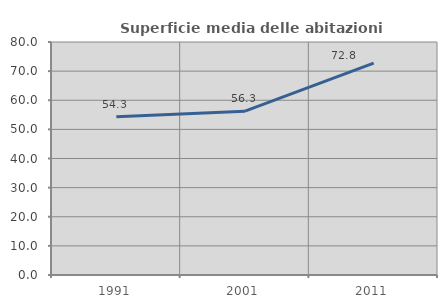
| Category | Superficie media delle abitazioni occupate |
|---|---|
| 1991.0 | 54.3 |
| 2001.0 | 56.254 |
| 2011.0 | 72.76 |